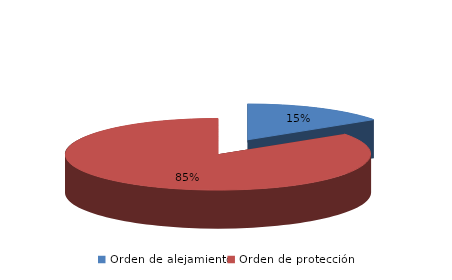
| Category | Series 0 |
|---|---|
| Orden de alejamiento | 38 |
| Orden de protección | 208 |